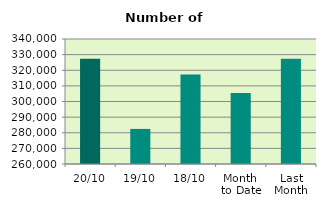
| Category | Series 0 |
|---|---|
| 20/10 | 327286 |
| 19/10 | 282450 |
| 18/10 | 317252 |
| Month 
to Date | 305376 |
| Last
Month | 327317.909 |